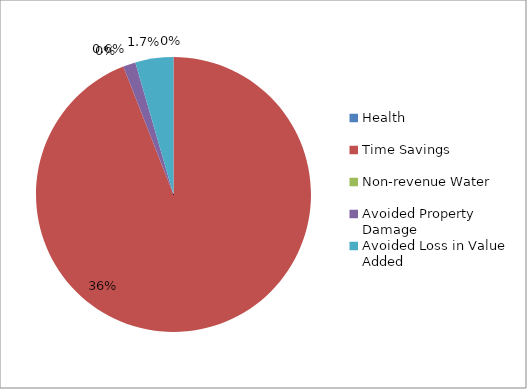
| Category | Series 0 |
|---|---|
| Health | 0 |
| Time Savings | 0.356 |
| Non-revenue Water | 0 |
| Avoided Property Damage | 0.006 |
| Avoided Loss in Value Added | 0.017 |